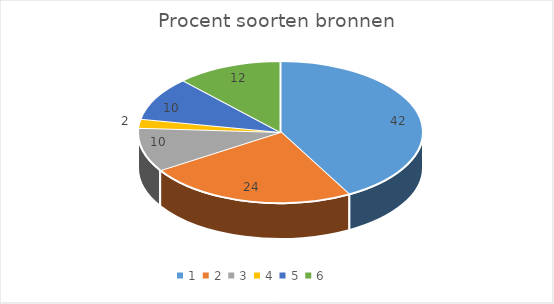
| Category | Series 0 |
|---|---|
| 0 | 42 |
| 1 | 24 |
| 2 | 10 |
| 3 | 2 |
| 4 | 10 |
| 5 | 12 |